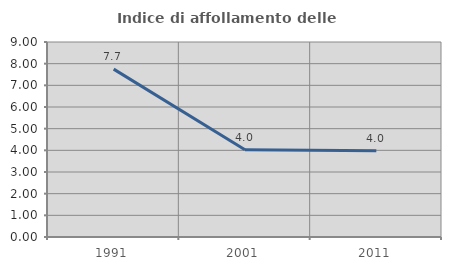
| Category | Indice di affollamento delle abitazioni  |
|---|---|
| 1991.0 | 7.748 |
| 2001.0 | 4.031 |
| 2011.0 | 3.985 |